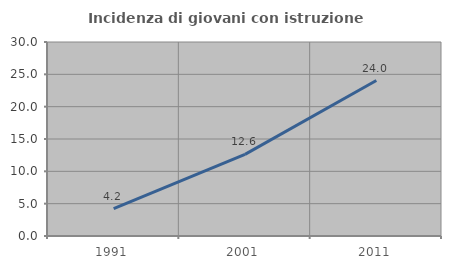
| Category | Incidenza di giovani con istruzione universitaria |
|---|---|
| 1991.0 | 4.239 |
| 2001.0 | 12.626 |
| 2011.0 | 24.038 |